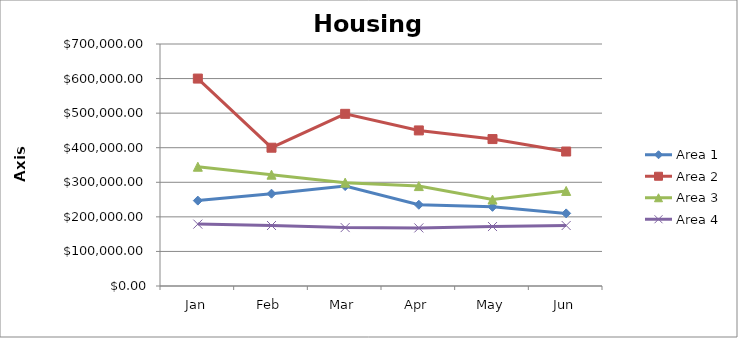
| Category | Area 1 | Area 2 | Area 3 | Area 4 |
|---|---|---|---|---|
| Jan | 247000 | 600000 | 345000 | 179000 |
| Feb | 267000 | 400000 | 322000 | 175000 |
| Mar | 289000 | 498000 | 299000 | 169000 |
| Apr | 235000 | 450000 | 289000 | 168000 |
| May | 229000 | 425000 | 250000 | 172000 |
| Jun | 210000 | 389000 | 275000 | 175000 |